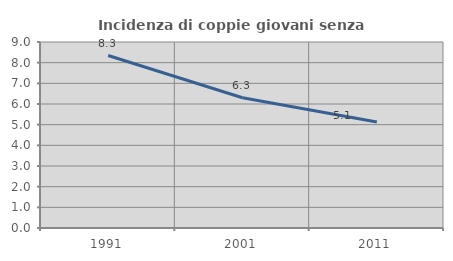
| Category | Incidenza di coppie giovani senza figli |
|---|---|
| 1991.0 | 8.346 |
| 2001.0 | 6.303 |
| 2011.0 | 5.125 |